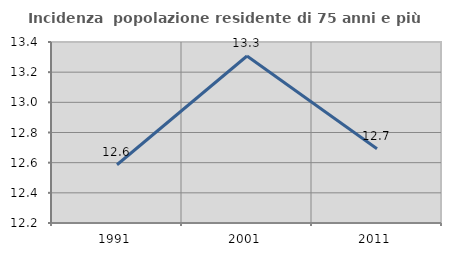
| Category | Incidenza  popolazione residente di 75 anni e più |
|---|---|
| 1991.0 | 12.586 |
| 2001.0 | 13.307 |
| 2011.0 | 12.693 |